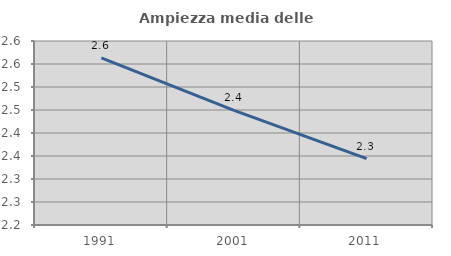
| Category | Ampiezza media delle famiglie |
|---|---|
| 1991.0 | 2.563 |
| 2001.0 | 2.449 |
| 2011.0 | 2.344 |